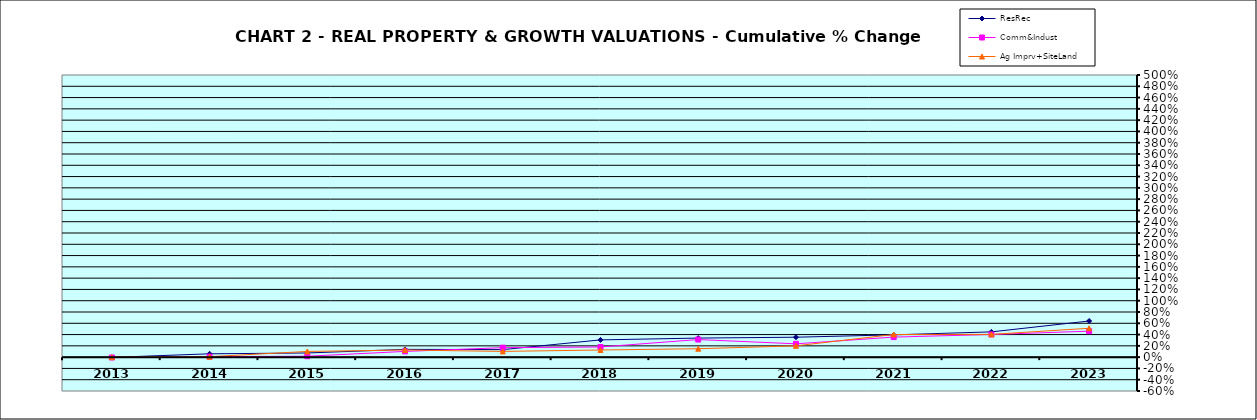
| Category | ResRec | Comm&Indust | Ag Imprv+SiteLand |
|---|---|---|---|
| 2013.0 | -0.004 | -0.006 | 0 |
| 2014.0 | 0.059 | 0.009 | 0.008 |
| 2015.0 | 0.074 | 0.017 | 0.101 |
| 2016.0 | 0.138 | 0.102 | 0.127 |
| 2017.0 | 0.133 | 0.168 | 0.102 |
| 2018.0 | 0.306 | 0.18 | 0.127 |
| 2019.0 | 0.338 | 0.312 | 0.149 |
| 2020.0 | 0.353 | 0.236 | 0.2 |
| 2021.0 | 0.395 | 0.355 | 0.401 |
| 2022.0 | 0.448 | 0.402 | 0.404 |
| 2023.0 | 0.64 | 0.46 | 0.512 |